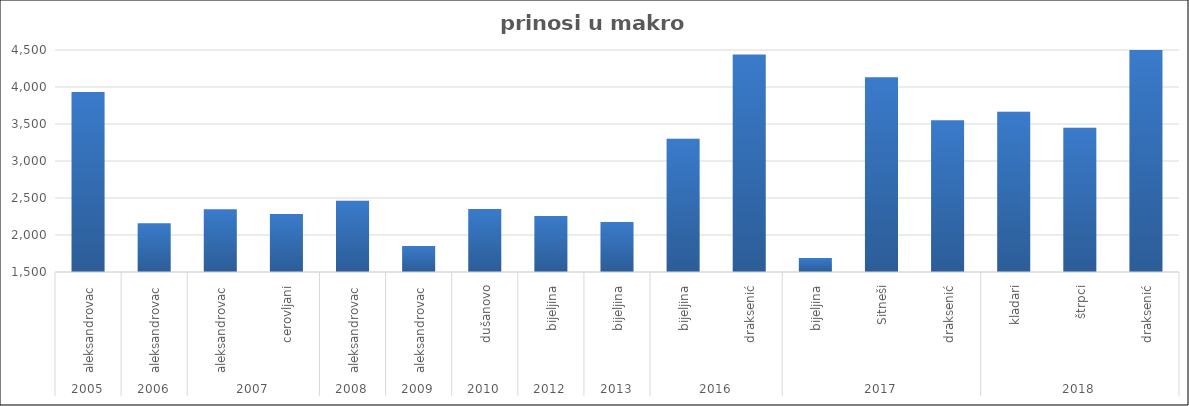
| Category | Series 0 |
|---|---|
| 0 | 3933.625 |
| 1 | 2159.792 |
| 2 | 2347.117 |
| 3 | 2284.533 |
| 4 | 2463.285 |
| 5 | 1850.476 |
| 6 | 2350.762 |
| 7 | 2258.182 |
| 8 | 2175.565 |
| 9 | 3299.917 |
| 10 | 4439.25 |
| 11 | 1689.5 |
| 12 | 4133.125 |
| 13 | 3549.625 |
| 14 | 3667 |
| 15 | 3451 |
| 16 | 4607 |